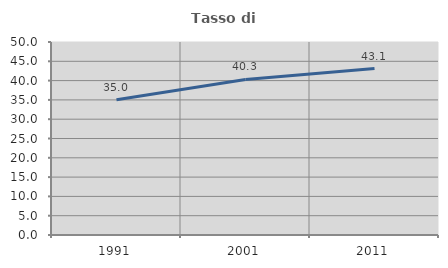
| Category | Tasso di occupazione   |
|---|---|
| 1991.0 | 35.045 |
| 2001.0 | 40.299 |
| 2011.0 | 43.125 |